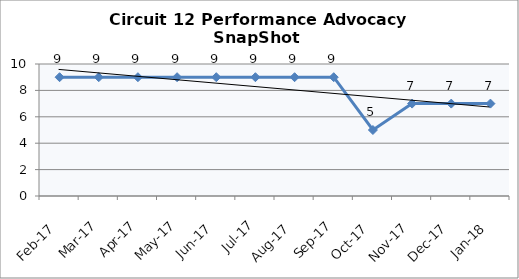
| Category | Circuit 12 |
|---|---|
| Feb-17 | 9 |
| Mar-17 | 9 |
| Apr-17 | 9 |
| May-17 | 9 |
| Jun-17 | 9 |
| Jul-17 | 9 |
| Aug-17 | 9 |
| Sep-17 | 9 |
| Oct-17 | 5 |
| Nov-17 | 7 |
| Dec-17 | 7 |
| Jan-18 | 7 |